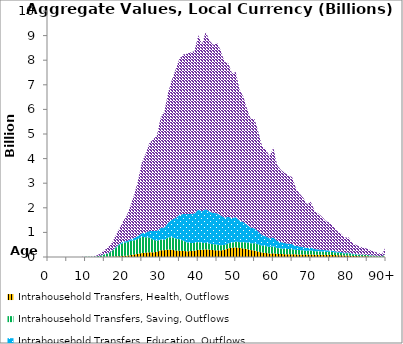
| Category | Intrahousehold Transfers, Health, Outflows | Intrahousehold Transfers, Saving, Outflows | Intrahousehold Transfers, Education, Outflows | Intrahousehold Transfers, Consumption other than health and education, Outflows |
|---|---|---|---|---|
| 0 | 0 | 0 | 0 | 0 |
|  | 0 | 0 | 0 | 0 |
| 2 | 0 | 0 | 0 | 0 |
| 3 | 0 | 0 | 0 | 0 |
| 4 | 0 | 0 | 0 | 0 |
| 5 | 0 | 0 | 0 | 0 |
| 6 | 0 | 0 | 0 | 0 |
| 7 | 0 | 0 | 0 | 0 |
| 8 | 0 | 0.654 | 0.044 | 0.265 |
| 9 | 0.005 | 3.382 | 0.225 | 1.978 |
| 10 | 0.032 | 5.113 | 0.294 | 3.901 |
| 11 | 0.214 | 5.891 | 0.272 | 6.382 |
| 12 | 0.942 | 9.667 | 0.416 | 19.539 |
| 13 | 1.496 | 24.891 | 2.099 | 35.412 |
| 14 | 2.722 | 50.355 | 7.328 | 83.725 |
| 15 | 6.714 | 98.34 | 10.888 | 160.901 |
| 16 | 10.815 | 134.418 | 11.528 | 233.176 |
| 17 | 14.782 | 219.929 | 12.916 | 323.825 |
| 18 | 23.014 | 339.072 | 31.28 | 474.436 |
| 19 | 30.95 | 463.562 | 41.934 | 624.405 |
| 20 | 43.699 | 524.204 | 53.97 | 836.078 |
| 21 | 54.185 | 539.722 | 55.78 | 1039.592 |
| 22 | 78.151 | 571.237 | 72.485 | 1383.224 |
| 23 | 106.149 | 574.577 | 95.671 | 1785.468 |
| 24 | 129.917 | 611.967 | 113.556 | 2272.015 |
| 25 | 162.807 | 650.19 | 150.474 | 2897.2 |
| 26 | 176.782 | 626.803 | 188.134 | 3196.101 |
| 27 | 190.221 | 599.3 | 265.37 | 3578.677 |
| 28 | 187.625 | 515.924 | 354.127 | 3722.905 |
| 29 | 213.511 | 445.49 | 406.241 | 3878.654 |
| 30 | 274.063 | 434.794 | 468.93 | 4482.173 |
| 31 | 278.279 | 418.193 | 508.068 | 4720.269 |
| 32 | 303.017 | 492.345 | 601.38 | 5295.454 |
| 33 | 296.666 | 511.48 | 710.008 | 5696.892 |
| 34 | 263.563 | 484.872 | 842.375 | 6039.429 |
| 35 | 256.304 | 466.608 | 987.538 | 6352.566 |
| 36 | 244.113 | 420.939 | 1084.12 | 6482.563 |
| 37 | 235.619 | 353.167 | 1158.459 | 6514.479 |
| 38 | 241 | 325.647 | 1183.523 | 6571.749 |
| 39 | 255.14 | 314.134 | 1201.008 | 6597.151 |
| 40 | 290.643 | 321.141 | 1315.723 | 7095.415 |
| 41 | 288.709 | 280.137 | 1286.875 | 6793.822 |
| 42 | 312.935 | 267.434 | 1366.346 | 7210.7 |
| 43 | 298.35 | 247.184 | 1302.863 | 6946.435 |
| 44 | 279.881 | 240.177 | 1272.894 | 6828.937 |
| 45 | 273.192 | 229.844 | 1273.27 | 6931.764 |
| 46 | 265.711 | 209.356 | 1210.956 | 6708.874 |
| 47 | 293.131 | 194.073 | 1114.428 | 6330.694 |
| 48 | 354.833 | 199.241 | 1077.561 | 6247.812 |
| 49 | 372.685 | 205.746 | 1008.028 | 5877.437 |
| 50 | 397.829 | 231.079 | 995.492 | 5893.23 |
| 51 | 367.045 | 233.279 | 884.196 | 5328.677 |
| 52 | 350.829 | 254.205 | 817.671 | 5100.395 |
| 53 | 321.119 | 266.797 | 720.531 | 4716.071 |
| 54 | 281.436 | 276.531 | 634.15 | 4414.161 |
| 55 | 262.449 | 298.872 | 602.527 | 4443.232 |
| 56 | 222.031 | 290.419 | 522.269 | 4053.995 |
| 57 | 181.871 | 275 | 436.357 | 3617.962 |
| 58 | 164.649 | 277.233 | 398.06 | 3536.726 |
| 59 | 140.685 | 266.03 | 349.539 | 3340.35 |
| 60 | 150.684 | 286.877 | 359.148 | 3650.733 |
| 61 | 126.78 | 237.664 | 288.808 | 3093.577 |
| 62 | 120.236 | 223.704 | 261.842 | 2934.133 |
| 63 | 115.381 | 215.481 | 237.802 | 2853.879 |
| 64 | 114.68 | 207.724 | 217.701 | 2781.667 |
| 65 | 116.195 | 202.416 | 204.61 | 2724.394 |
| 66 | 106.954 | 182.296 | 166.575 | 2338.457 |
| 67 | 104.637 | 175.437 | 150.856 | 2140.503 |
| 68 | 103.265 | 166.931 | 132.657 | 1999.16 |
| 69 | 97.151 | 151.555 | 113.013 | 1770.234 |
| 70 | 106.92 | 161.844 | 114.003 | 1863.454 |
| 71 | 93.141 | 138.236 | 91.524 | 1547.287 |
| 72 | 92.408 | 135.091 | 83.151 | 1455.801 |
| 73 | 90.285 | 130.093 | 73.833 | 1335.916 |
| 74 | 85.728 | 121.573 | 63.802 | 1187.216 |
| 75 | 86.976 | 122.226 | 58.942 | 1124.025 |
| 76 | 81.654 | 114.921 | 50.228 | 983.139 |
| 77 | 73.156 | 104.545 | 42.049 | 836.339 |
| 78 | 69.032 | 100.943 | 37.598 | 758.465 |
| 79 | 57.362 | 86.952 | 30.093 | 616.758 |
| 80 | 58.886 | 92.951 | 29.689 | 620.347 |
| 81 | 43.451 | 70.799 | 21.002 | 439.741 |
| 82 | 37.976 | 64.344 | 17.665 | 373.985 |
| 83 | 32.697 | 57.549 | 14.656 | 312.778 |
| 84 | 30.363 | 55.52 | 13.156 | 282.242 |
| 85 | 26.608 | 51.057 | 11.668 | 244.256 |
| 86 | 21.141 | 42.706 | 9.242 | 192.385 |
| 87 | 16.559 | 35.217 | 7.17 | 149.509 |
| 88 | 13.03 | 29.286 | 5.599 | 117.362 |
| 89 | 9.935 | 23.716 | 4.241 | 89.823 |
| 90+ | 33.459 | 85.35 | 14.2 | 305.62 |